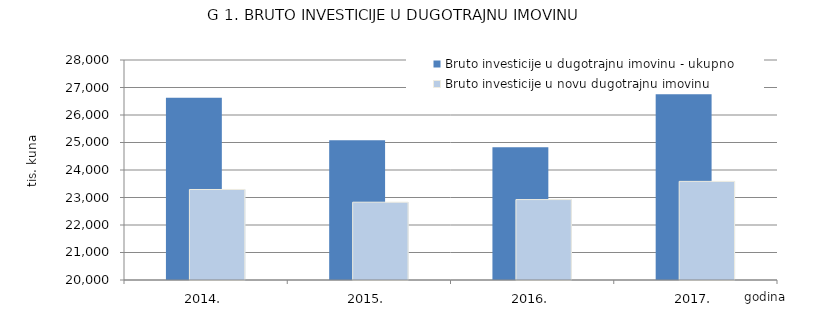
| Category | Bruto investicije u dugotrajnu imovinu - ukupno | Bruto investicije u novu dugotrajnu imovinu |
|---|---|---|
| 2014. | 26626 | 23291 |
| 2015. | 25079 | 22829 |
| 2016. | 24830 | 22925 |
| 2017. | 26759 | 23586 |